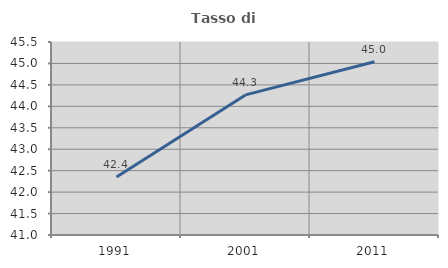
| Category | Tasso di occupazione   |
|---|---|
| 1991.0 | 42.351 |
| 2001.0 | 44.267 |
| 2011.0 | 45.039 |